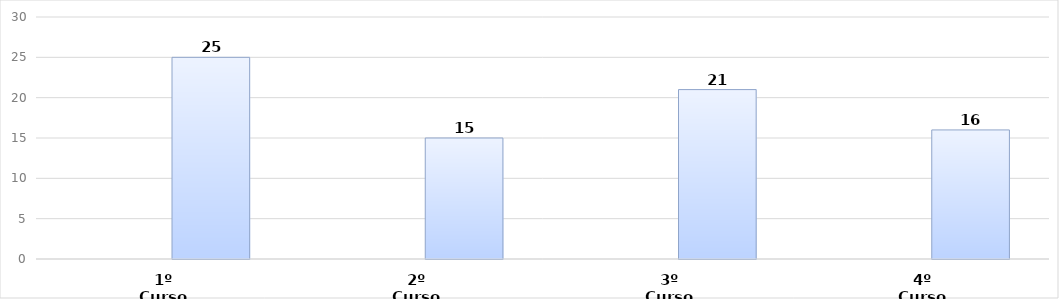
| Category | Series 0 | Series 1 |
|---|---|---|
| 1º Curso |  | 25 |
| 2º Curso |  | 15 |
| 3º Curso |  | 21 |
| 4º Curso |  | 16 |